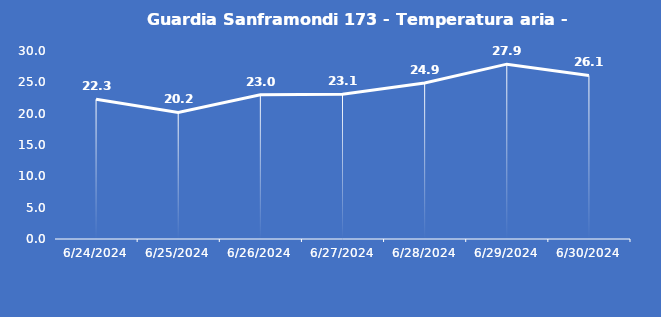
| Category | Guardia Sanframondi 173 - Temperatura aria - Grezzo (°C) |
|---|---|
| 6/24/24 | 22.3 |
| 6/25/24 | 20.2 |
| 6/26/24 | 23 |
| 6/27/24 | 23.1 |
| 6/28/24 | 24.9 |
| 6/29/24 | 27.9 |
| 6/30/24 | 26.1 |